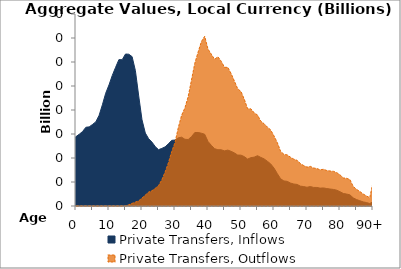
| Category | Private Transfers, Inflows | Private Transfers, Outflows |
|---|---|---|
| 0 | 5.783 | 0 |
|  | 5.984 | 0 |
| 2 | 6.209 | 0 |
| 3 | 6.561 | 0 |
| 4 | 6.594 | 0 |
| 5 | 6.794 | 0 |
| 6 | 7.012 | 0 |
| 7 | 7.55 | 0 |
| 8 | 8.435 | 0 |
| 9 | 9.396 | 0 |
| 10 | 10.091 | 0 |
| 11 | 10.883 | 0 |
| 12 | 11.556 | 0 |
| 13 | 12.197 | 0 |
| 14 | 12.192 | 0 |
| 15 | 12.665 | 0 |
| 16 | 12.648 | 0.102 |
| 17 | 12.446 | 0.216 |
| 18 | 11.279 | 0.326 |
| 19 | 9.177 | 0.428 |
| 20 | 7.181 | 0.66 |
| 21 | 6.082 | 0.907 |
| 22 | 5.612 | 1.154 |
| 23 | 5.328 | 1.269 |
| 24 | 4.959 | 1.467 |
| 25 | 4.691 | 1.698 |
| 26 | 4.799 | 2.175 |
| 27 | 4.928 | 2.824 |
| 28 | 5.182 | 3.598 |
| 29 | 5.471 | 4.527 |
| 30 | 5.497 | 5.288 |
| 31 | 5.68 | 6.531 |
| 32 | 5.735 | 7.558 |
| 33 | 5.561 | 8.17 |
| 34 | 5.541 | 9.117 |
| 35 | 5.784 | 10.505 |
| 36 | 6.121 | 11.891 |
| 37 | 6.127 | 12.823 |
| 38 | 6.066 | 13.7 |
| 39 | 5.977 | 14.145 |
| 40 | 5.377 | 13.074 |
| 41 | 5.058 | 12.651 |
| 42 | 4.775 | 12.224 |
| 43 | 4.689 | 12.434 |
| 44 | 4.685 | 12.064 |
| 45 | 4.591 | 11.558 |
| 46 | 4.659 | 11.554 |
| 47 | 4.556 | 11.041 |
| 48 | 4.422 | 10.408 |
| 49 | 4.245 | 9.77 |
| 50 | 4.237 | 9.54 |
| 51 | 4.115 | 8.892 |
| 52 | 3.909 | 8.106 |
| 53 | 4.03 | 8.094 |
| 54 | 4.071 | 7.761 |
| 55 | 4.193 | 7.584 |
| 56 | 4.051 | 7.066 |
| 57 | 3.926 | 6.856 |
| 58 | 3.726 | 6.575 |
| 59 | 3.506 | 6.337 |
| 60 | 3.161 | 5.838 |
| 61 | 2.702 | 5.29 |
| 62 | 2.269 | 4.56 |
| 63 | 2.088 | 4.305 |
| 64 | 2.055 | 4.26 |
| 65 | 1.913 | 4.064 |
| 66 | 1.831 | 3.903 |
| 67 | 1.797 | 3.806 |
| 68 | 1.655 | 3.536 |
| 69 | 1.619 | 3.371 |
| 70 | 1.56 | 3.238 |
| 71 | 1.623 | 3.304 |
| 72 | 1.549 | 3.165 |
| 73 | 1.545 | 3.121 |
| 74 | 1.488 | 3.016 |
| 75 | 1.507 | 3.06 |
| 76 | 1.454 | 2.956 |
| 77 | 1.414 | 2.916 |
| 78 | 1.381 | 2.89 |
| 79 | 1.319 | 2.783 |
| 80 | 1.191 | 2.598 |
| 81 | 1.045 | 2.34 |
| 82 | 0.997 | 2.307 |
| 83 | 0.931 | 2.204 |
| 84 | 0.678 | 1.633 |
| 85 | 0.537 | 1.385 |
| 86 | 0.442 | 1.212 |
| 87 | 0.344 | 1.003 |
| 88 | 0.29 | 0.842 |
| 89 | 0.208 | 0.688 |
| 90+ | 0.346 | 1.94 |